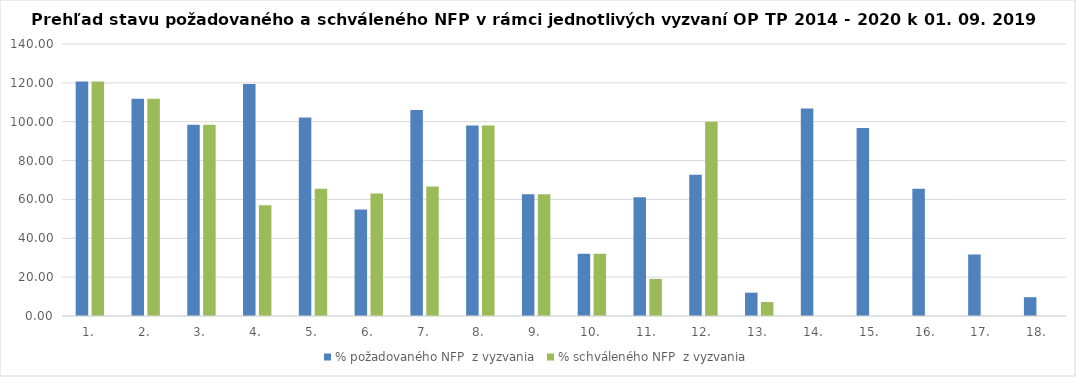
| Category | % požadovaného NFP  z vyzvania | % schváleného NFP  z vyzvania |
|---|---|---|
| 1. | 120.662 | 120.662 |
| 2. | 111.83 | 111.83 |
| 3. | 98.465 | 98.465 |
| 4. | 119.382 | 57.06 |
| 5. | 102.181 | 65.461 |
| 6. | 54.857 | 63.077 |
| 7. | 105.992 | 66.691 |
| 8. | 97.989 | 97.989 |
| 9. | 62.721 | 62.721 |
| 10. | 32.038 | 32.038 |
| 11. | 61.165 | 19.087 |
| 12. | 72.726 | 99.998 |
| 13. | 12.007 | 7.184 |
| 14. | 106.838 | 0 |
| 15. | 96.768 | 0 |
| 16. | 65.439 | 0 |
| 17. | 31.659 | 0 |
| 18. | 9.68 | 0 |